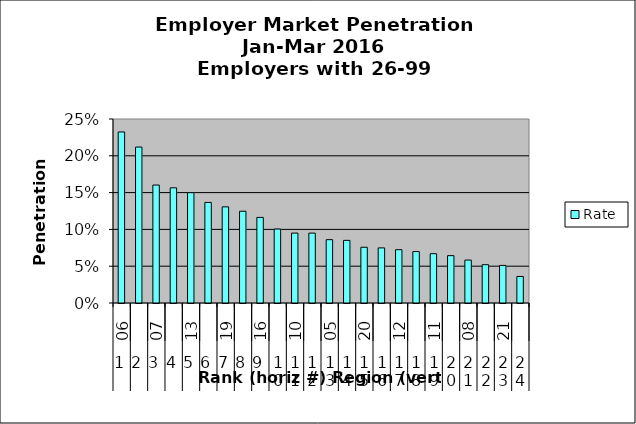
| Category | Rate |
|---|---|
| 0 | 0.232 |
| 1 | 0.212 |
| 2 | 0.16 |
| 3 | 0.156 |
| 4 | 0.15 |
| 5 | 0.137 |
| 6 | 0.131 |
| 7 | 0.125 |
| 8 | 0.116 |
| 9 | 0.101 |
| 10 | 0.095 |
| 11 | 0.095 |
| 12 | 0.086 |
| 13 | 0.085 |
| 14 | 0.076 |
| 15 | 0.075 |
| 16 | 0.072 |
| 17 | 0.07 |
| 18 | 0.067 |
| 19 | 0.064 |
| 20 | 0.058 |
| 21 | 0.052 |
| 22 | 0.051 |
| 23 | 0.036 |